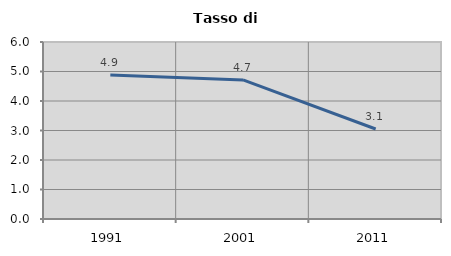
| Category | Tasso di disoccupazione   |
|---|---|
| 1991.0 | 4.878 |
| 2001.0 | 4.715 |
| 2011.0 | 3.052 |